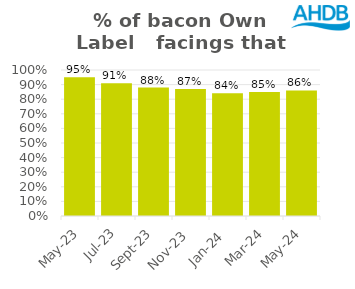
| Category | Bacon |
|---|---|
| 2023-05-01 | 0.95 |
| 2023-07-01 | 0.91 |
| 2023-09-01 | 0.88 |
| 2023-11-01 | 0.87 |
| 2024-01-01 | 0.84 |
| 2024-03-01 | 0.85 |
| 2024-05-01 | 0.86 |